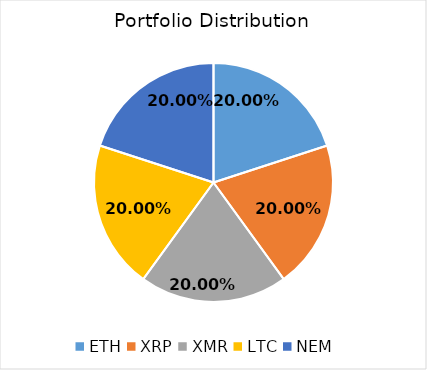
| Category | Series 0 |
|---|---|
| ETH | 0.2 |
| XRP | 0.2 |
| XMR | 0.2 |
| LTC | 0.2 |
| NEM | 0.2 |